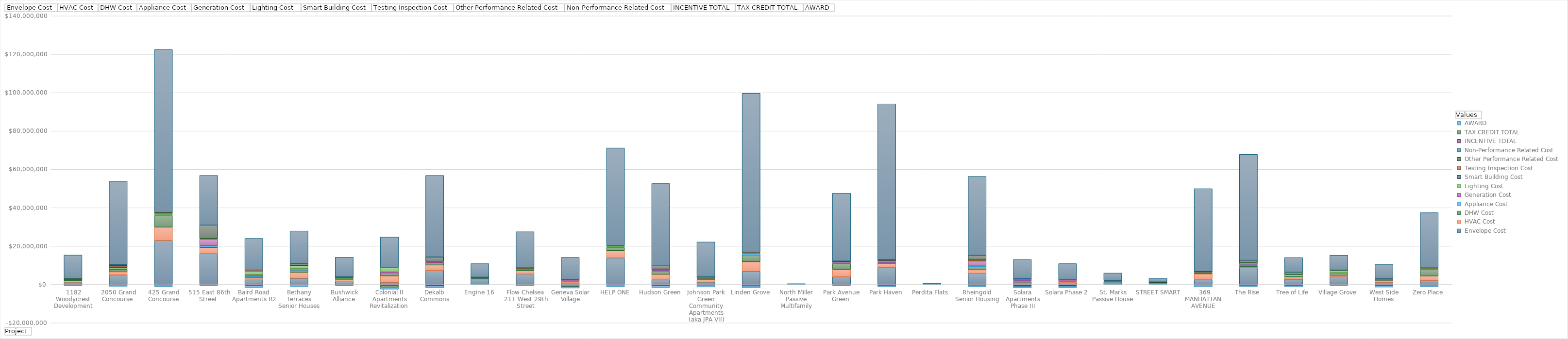
| Category |  Envelope Cost |  HVAC Cost |  DHW Cost |  Appliance Cost |  Generation Cost |  Lighting Cost  |  Smart Building Cost |  Testing Inspection Cost |  Other Performance Related Cost |  Non-Performance Related Cost |  INCENTIVE TOTAL |  TAX CREDIT TOTAL |  AWARD |
|---|---|---|---|---|---|---|---|---|---|---|---|---|---|
| 1182 Woodycrest Development | 1130801.59 | 879051 | 240000 | 140736 | 0 | 200000 | 0 | 0 | 645948 | 12128463.81 | -169700 | 0 | -350931 |
| 2050 Grand Concourse  | 4967658.213 | 1592848.164 | 1059435.67 | 183414 | 254596.04 | 807248.033 | 325541.73 | 689125 | 502235.25 | 43460922.157 | -235624 | -55599 | -647500 |
| 425 Grand Concourse | 22898351.84 | 6998906 | 6106206 | 434701 | 0 | 617156 | 0 | 546700 | 50300 | 84887679.16 | -300000 | 0 | -750000 |
| 515 East 86th Street  | 16052777 | 3168000 | 307000 | 788116 | 3072683 | 553272 | 0 | 0 | 7001039.706 | 25917381.706 | -99617.8 | 0 | -425000 |
| Baird Road Apartments R2 | 2359448 | 1068480 | 740740 | 357200 | 679542 | 1711476 | 0 | 580375 | 0 | 16517486 | -414103 | -142814 | -1000000 |
| Bethany Terraces Senior Houses | 3168985 | 3176351 | 1039500 | 128262 | 768000 | 1422180 | 0 | 172420 | 983657 | 17051589 | -199800 | 0 | -810400 |
| Bushwick Alliance | 1357000 | 1360000 | 53000 | 80000 | 228000 | 355000 | 0 | 0 | 534413 | 10261135 | -70000 | -67354 | -401180 |
| Colonial II Apartments Revitalization | 1096000 | 3357410 | 1467133 | 169375 | 505440 | 2335100 | 0 | 0 | 0 | 15804978 | -459000 | -990064 | -1000000 |
| Dekalb Commons | 7230000 | 2925000 | 1050000 | 151700 | 374500 | 340000 | 0 | 0 | 2283800 | 42507863.5 | -619232 | -111363 | -1000000 |
| Engine 16 | 2859020.71 | 245125 | 153472 | 69500 | 39415 | 41750 | 0 | 0 | 423479.42 | 7052230.21 | -6400 | -19088 | -167458.5 |
| Flow Chelsea 211 West 29th Street | 5414207.77 | 1755748.5 | 356582 | 462963.94 | 157000 | 246715.67 | 50000 | 53050 | 198249.76 | 18820784.21 | -145660 | -49394 | -500000 |
| Geneva Solar Village | 823994 | 520783 | 73950 | 410325 | 571158 | 41511 | 0 | 0 | 64637.931 | 11648847 | -978000 | -140885 | -727236 |
| HELP ONE | 13820490 | 3860000 | 1521600 | 291269 | 263398 | 468693 | 0 | 142906 | 0 | 50797762.19 | -300000 | 0 | -850000 |
| Hudson Green | 2407694.931 | 2900092.81 | 1545000 | 374147 | 411400 | 281632.424 | 0 | 37000 | 1742800 | 42929555.668 | -555000 | 0 | -1000000 |
| Johnson Park Green Community Apartments (aka JPA VII) | 1185162 | 1437001 | 315000 | 118000 | 104350 | 117500 | 0 | 41096.64 | 724133.087 | 18133115.736 | -247999.99 | -76131 | -1000000 |
| Linden Grove | 6779865.441 | 5074592.04 | 3559889.291 | 572717.547 | 232500 | 400000 | 0 | 189900 | 0 | 82895592.98 | -700000 | -100000 | -1000000 |
| North Miller Passive Multifamily | 96977.91 | 8539.65 | 5400 | 7000 | 27815 | 2147.13 | 2300 | 7650 | 5000 | 289777.66 | -12600 | -14255 | -39467 |
| Park Avenue Green  | 4079691.16 | 3770484.94 | 3048214.42 | 63526 | 682830 | 141119.7 | 365000 | 73675 | 0 | 35399236.42 | -270600 | -20400 | -250000 |
| Park Haven | 8918168 | 2028100 | 91500 | 404336 | 339261 | 639515.63 | 403739.06 | 45775 | 100000 | 81164882.15 | -508200 | 0 | -750000 |
| Perdita Flats  | 64925.8 | 30000 | 12400 | 21000 | 34600 | 750 | 0 | 0 | 0 | 500484.2 | -6400 | -14933 | -59976 |
| Rheingold Senior Housing | 5651719.02 | 1965400 | 1791250 | 239216.96 | 2535918.75 | 294500 | 0 | 310000 | 2405000 | 41171001.61 | -339240 | -52250 | -637500 |
| Solara Apartments Phase III | 1158315 | 575523 | 60000 | 293556 | 678000 | 51000 | 45000 | 22372 | 131321 | 10040663.95 | -587500 | -415800 | -750000 |
| Solara Phase 2 | 884237 | 575523 | 60000 | 299400 | 678000 | 51000 | 45000 | 20826 | 0 | 8280460 | -571050 | -283035 | -750000 |
| St. Marks Passive House | 1286500 | 275000 | 105000 | 120000 | 40000 | 80000 | 0 | 0 | 186730 | 3887850 | -13608 | -29906 | -203082 |
| STREET SMART, 369 MANHATTAN AVENUE | 599808 | 202508.5 | 84613.27 | 91957 | 65343 | 45000 | 7008 | 0 | 231011.1 | 1879319.53 | -1530 | -24144 | -89260 |
| The Rise | 2579052 | 2922400 | 300000 | 212800 | 273845 | 280000 | 0 | 0 | 260966 | 43128939.45 | -279680 | 0 | -1000000 |
| Tree of Life | 8908493.25 | 366127.83 | 575000 | 625000 | 679194.51 | 300000 | 0 | 0 | 1195947.3 | 55205071.24 | -320000 | -185526 | -500000 |
| Village Grove | 2770500 | 1174200 | 320280 | 30642.95 | 0 | 888684 | 0 | 0 | 1189475 | 7697481.89 | -513976 | 0 | -792438 |
| West Side Homes | 4104825.56 | 695077 | 1134500 | 99865 | 119136.74 | 1135010 | 0 | 0 | 224844.694 | 7763945.9 | -115819 | -27878 | -362620 |
| Zero Place | 1101500 | 1100000 | 50000 | 110630 | 475000 | 10000 | 215000 | 45000 | 0 | 7440183 | -315040 | -313400 | -750000 |
| Castle III | 2089823 | 2320000 | 3430000 | 149400 | 396760 | 174255 | 0 | 64035 | 56115 | 28770412 | -328000 | 0 | -850000 |